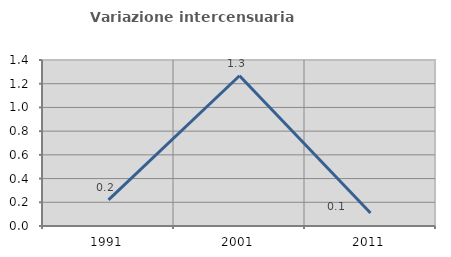
| Category | Variazione intercensuaria annua |
|---|---|
| 1991.0 | 0.221 |
| 2001.0 | 1.267 |
| 2011.0 | 0.11 |